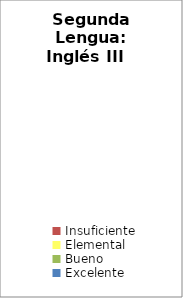
| Category | Segunda Lengua: Inglés III |
|---|---|
| Insuficiente | 0 |
| Elemental | 0 |
| Bueno | 0 |
| Excelente | 0 |